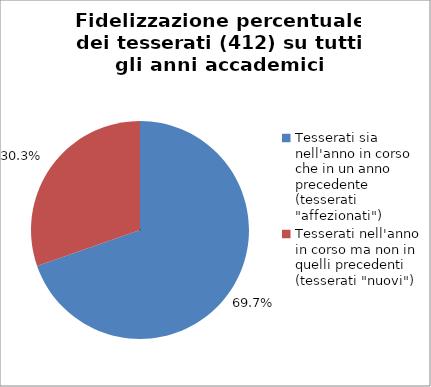
| Category | Nr. Tesserati |
|---|---|
| Tesserati sia nell'anno in corso che in un anno precedente (tesserati "affezionati") | 287 |
| Tesserati nell'anno in corso ma non in quelli precedenti (tesserati "nuovi") | 125 |